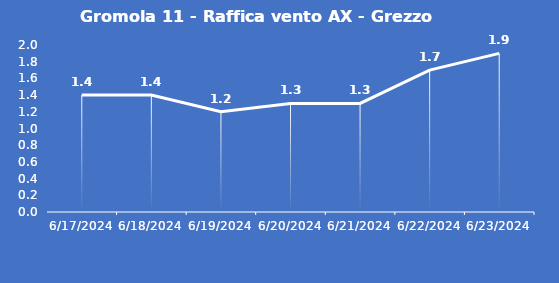
| Category | Gromola 11 - Raffica vento AX - Grezzo (m/s) |
|---|---|
| 6/17/24 | 1.4 |
| 6/18/24 | 1.4 |
| 6/19/24 | 1.2 |
| 6/20/24 | 1.3 |
| 6/21/24 | 1.3 |
| 6/22/24 | 1.7 |
| 6/23/24 | 1.9 |